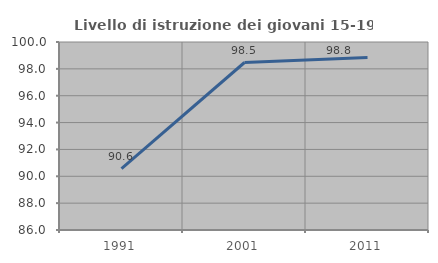
| Category | Livello di istruzione dei giovani 15-19 anni |
|---|---|
| 1991.0 | 90.576 |
| 2001.0 | 98.473 |
| 2011.0 | 98.844 |